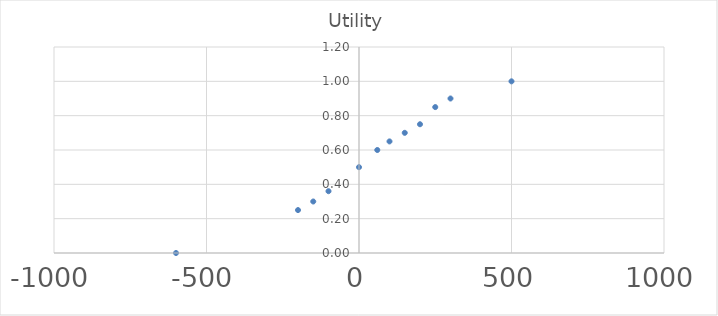
| Category | Series 0 |
|---|---|
| -600.0 | 0 |
| -200.0 | 0.25 |
| -150.0 | 0.3 |
| -100.0 | 0.36 |
| 0.0 | 0.5 |
| 60.0 | 0.6 |
| 100.0 | 0.65 |
| 150.0 | 0.7 |
| 200.0 | 0.75 |
| 250.0 | 0.85 |
| 300.0 | 0.9 |
| 500.0 | 1 |